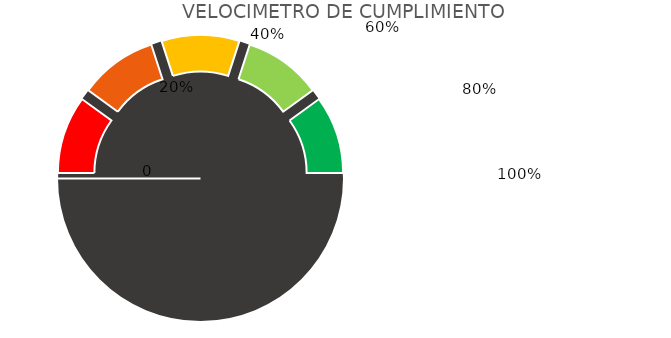
| Category | Puntero |
|---|---|
| 0 | 0 |
| 1 | 0.03 |
| 2 | 0 |